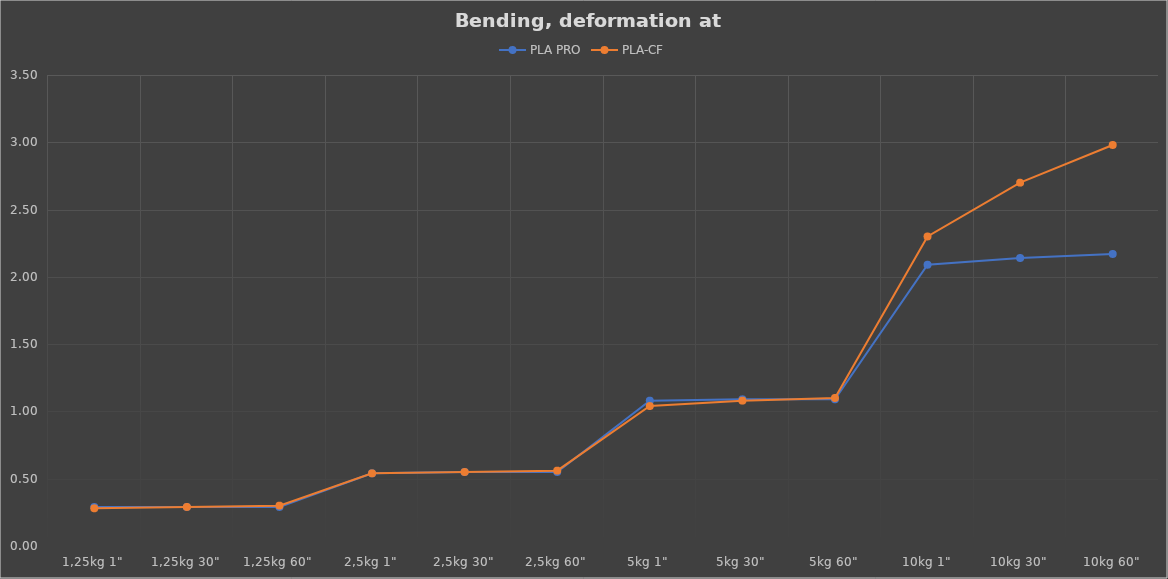
| Category | PLA PRO | PLA-CF |
|---|---|---|
| 1,25kg 1" | 0.29 | 0.28 |
| 1,25kg 30" | 0.29 | 0.29 |
| 1,25kg 60" | 0.29 | 0.3 |
| 2,5kg 1" | 0.54 | 0.54 |
| 2,5kg 30" | 0.55 | 0.55 |
| 2,5kg 60" | 0.55 | 0.56 |
| 5kg 1" | 1.08 | 1.04 |
| 5kg 30" | 1.09 | 1.08 |
| 5kg 60" | 1.09 | 1.1 |
| 10kg 1" | 2.09 | 2.3 |
| 10kg 30" | 2.14 | 2.7 |
| 10kg 60" | 2.17 | 2.98 |